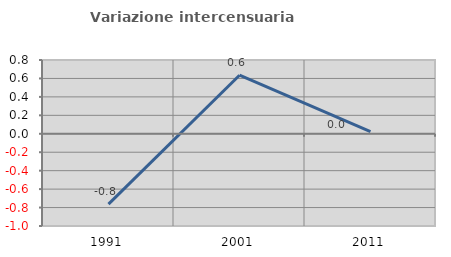
| Category | Variazione intercensuaria annua |
|---|---|
| 1991.0 | -0.762 |
| 2001.0 | 0.635 |
| 2011.0 | 0.023 |